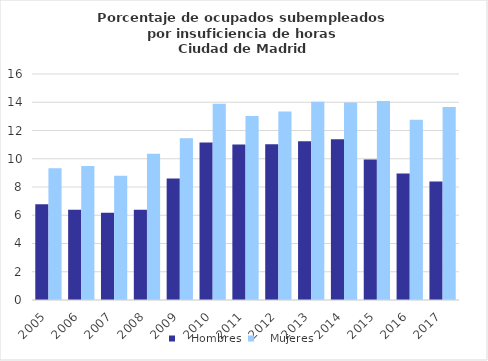
| Category |    Hombres |    Mujeres |
|---|---|---|
| 2005.0 | 6.774 | 9.336 |
| 2006.0 | 6.394 | 9.478 |
| 2007.0 | 6.184 | 8.799 |
| 2008.0 | 6.395 | 10.35 |
| 2009.0 | 8.609 | 11.447 |
| 2010.0 | 11.15 | 13.894 |
| 2011.0 | 11.005 | 13.018 |
| 2012.0 | 11.032 | 13.341 |
| 2013.0 | 11.246 | 14.038 |
| 2014.0 | 11.379 | 13.978 |
| 2015.0 | 9.938 | 14.089 |
| 2016.0 | 8.957 | 12.768 |
| 2017.0 | 8.385 | 13.667 |